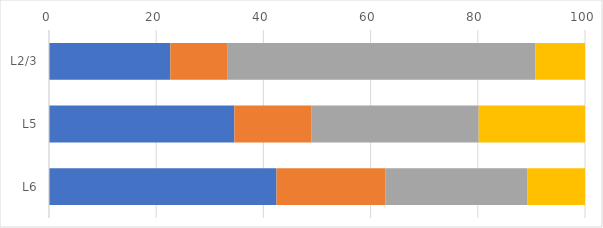
| Category | Series 0 | Series 1 | Series 2 | Series 3 |
|---|---|---|---|---|
| L2/3 | 22.639 | 10.709 | 57.363 | 9.288 |
| L5 | 34.588 | 14.323 | 31.258 | 19.831 |
| L6 | 42.447 | 20.279 | 26.479 | 10.795 |